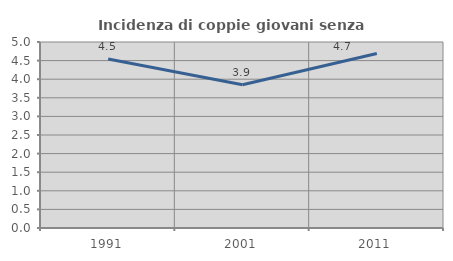
| Category | Incidenza di coppie giovani senza figli |
|---|---|
| 1991.0 | 4.545 |
| 2001.0 | 3.851 |
| 2011.0 | 4.692 |